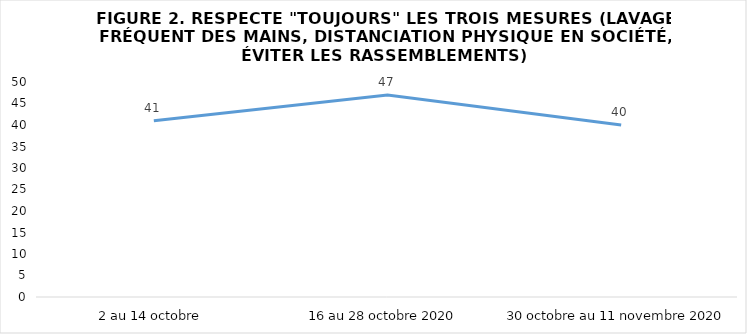
| Category | Series 0 |
|---|---|
| 2 au 14 octobre | 41 |
| 16 au 28 octobre 2020 | 47 |
| 30 octobre au 11 novembre 2020 | 40 |